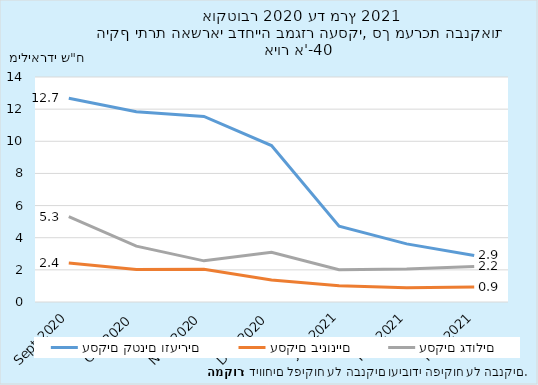
| Category | עסקים קטנים וזעירים | עסקים בינוניים | עסקים גדולים |
|---|---|---|---|
| 2020-09-30 | 12.676 | 2.426 | 5.313 |
| 2020-10-31 | 11.839 | 2.02 | 3.476 |
| 2020-11-30 | 11.547 | 2.039 | 2.561 |
| 2020-12-31 | 9.736 | 1.364 | 3.096 |
| 2021-01-31 | 4.723 | 1.005 | 2.007 |
| 2021-02-28 | 3.618 | 0.894 | 2.06 |
| 2021-03-31 | 2.896 | 0.939 | 2.21 |